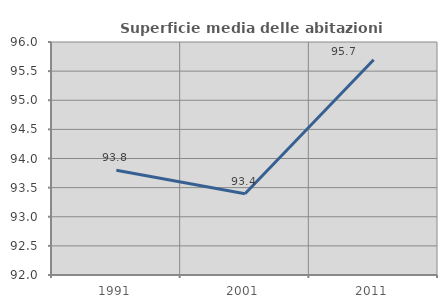
| Category | Superficie media delle abitazioni occupate |
|---|---|
| 1991.0 | 93.799 |
| 2001.0 | 93.395 |
| 2011.0 | 95.696 |